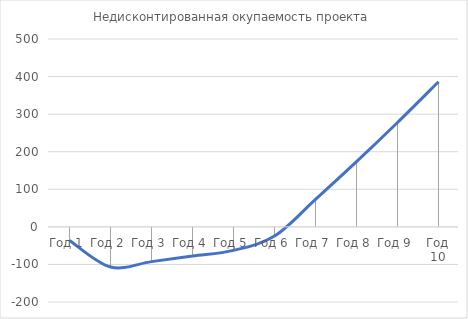
| Category | Недисконтированная окупаемость проекта |
|---|---|
| Год 1 | -36 |
| Год 2 | -106.896 |
| Год 3 | -92.564 |
| Год 4 | -77.786 |
| Год 5 | -62.547 |
| Год 6 | -24.405 |
| Год 7 | 72.998 |
| Год 8 | 173.414 |
| Год 9 | 277.792 |
| Год 10 | 386.283 |